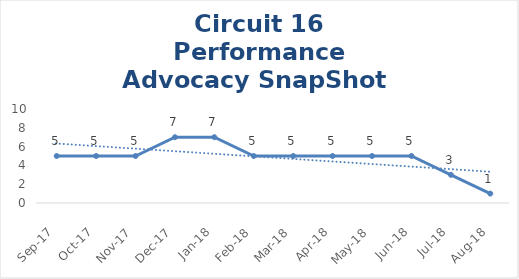
| Category | Circuit 16 |
|---|---|
| Sep-17 | 5 |
| Oct-17 | 5 |
| Nov-17 | 5 |
| Dec-17 | 7 |
| Jan-18 | 7 |
| Feb-18 | 5 |
| Mar-18 | 5 |
| Apr-18 | 5 |
| May-18 | 5 |
| Jun-18 | 5 |
| Jul-18 | 3 |
| Aug-18 | 1 |